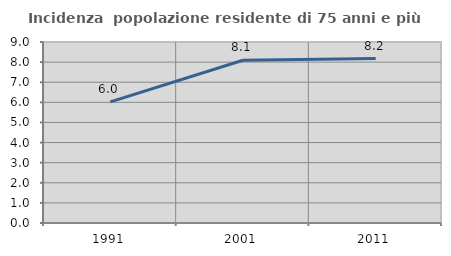
| Category | Incidenza  popolazione residente di 75 anni e più |
|---|---|
| 1991.0 | 6.023 |
| 2001.0 | 8.094 |
| 2011.0 | 8.175 |